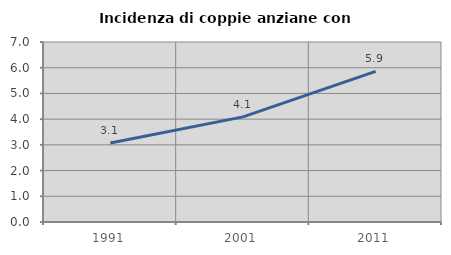
| Category | Incidenza di coppie anziane con figli |
|---|---|
| 1991.0 | 3.072 |
| 2001.0 | 4.089 |
| 2011.0 | 5.858 |